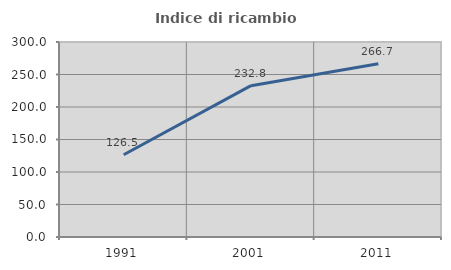
| Category | Indice di ricambio occupazionale  |
|---|---|
| 1991.0 | 126.471 |
| 2001.0 | 232.792 |
| 2011.0 | 266.667 |